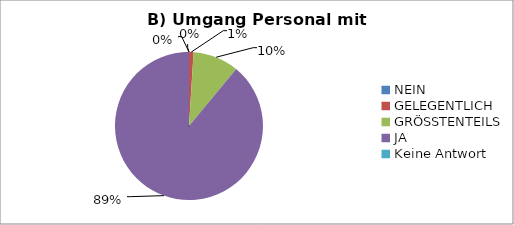
| Category | Series 0 |
|---|---|
| NEIN | 0 |
| GELEGENTLICH | 1 |
| GRÖSSTENTEILS | 10 |
| JA | 89 |
| Keine Antwort | 0 |